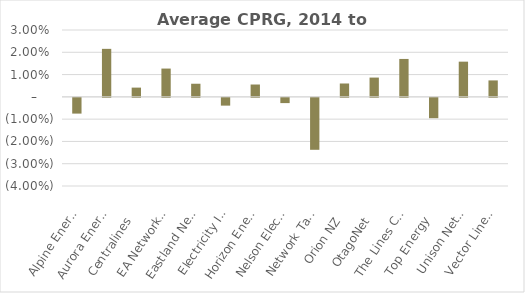
| Category | Series 0 |
|---|---|
|  Alpine Energy  | -0.007 |
|  Aurora Energy  | 0.022 |
|  Centralines  | 0.004 |
|  EA Networks  | 0.013 |
|  Eastland Network  | 0.006 |
|  Electricity Invercargill  | -0.003 |
|  Horizon Energy  | 0.006 |
|  Nelson Electricity  | -0.002 |
|  Network Tasman  | -0.023 |
|  Orion NZ  | 0.006 |
|  OtagoNet  | 0.009 |
|  The Lines Company  | 0.017 |
|  Top Energy  | -0.009 |
|  Unison Networks  | 0.016 |
|  Vector Lines  | 0.007 |